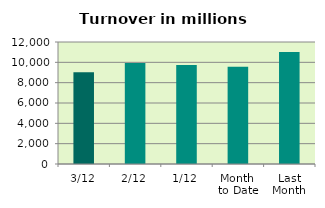
| Category | Series 0 |
|---|---|
| 3/12 | 9036.021 |
| 2/12 | 9944.763 |
| 1/12 | 9746.434 |
| Month 
to Date | 9575.739 |
| Last
Month | 11011.83 |